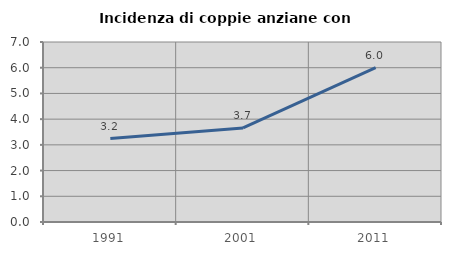
| Category | Incidenza di coppie anziane con figli |
|---|---|
| 1991.0 | 3.247 |
| 2001.0 | 3.659 |
| 2011.0 | 6 |